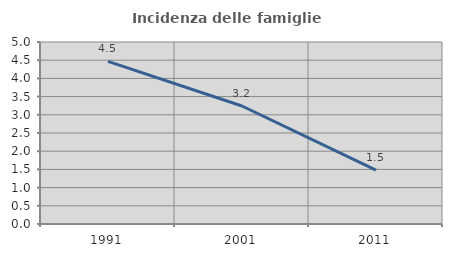
| Category | Incidenza delle famiglie numerose |
|---|---|
| 1991.0 | 4.467 |
| 2001.0 | 3.242 |
| 2011.0 | 1.481 |